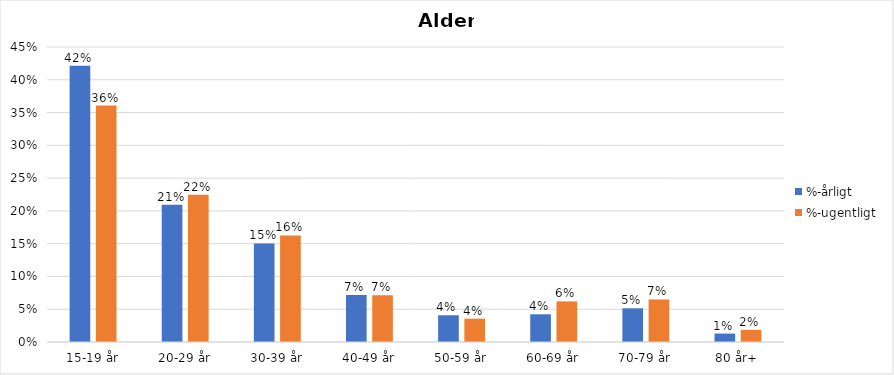
| Category | %-årligt | %-ugentligt |
|---|---|---|
| 15-19 år | 0.421 | 0.361 |
| 20-29 år | 0.209 | 0.224 |
| 30-39 år | 0.15 | 0.163 |
| 40-49 år | 0.072 | 0.071 |
| 50-59 år | 0.041 | 0.036 |
| 60-69 år | 0.042 | 0.062 |
| 70-79 år | 0.051 | 0.065 |
| 80 år+ | 0.013 | 0.019 |